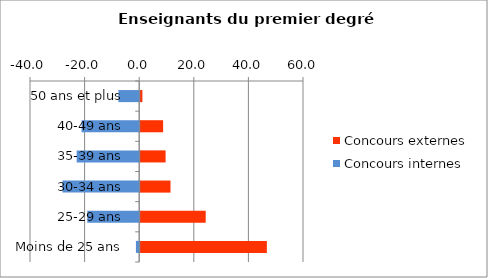
| Category | Concours externes | Concours internes |
|---|---|---|
| 50 ans et plus | 0.8 | -7.6 |
| 40-49 ans | 8.4 | -21.1 |
| 35-39 ans | 9.3 | -22.9 |
| 30-34 ans | 11.1 | -28.1 |
| 25-29 ans | 24 | -19 |
| Moins de 25 ans | 46.4 | -1.2 |